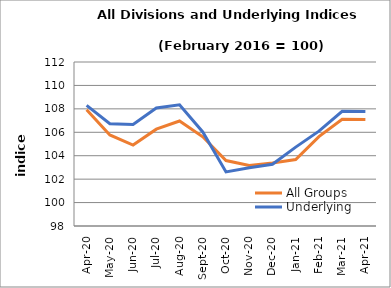
| Category | All Groups | Underlying |
|---|---|---|
| 2020-04-01 | 107.93 | 108.297 |
| 2020-05-01 | 105.77 | 106.735 |
| 2020-06-01 | 104.913 | 106.661 |
| 2020-07-01 | 106.265 | 108.077 |
| 2020-08-01 | 106.963 | 108.349 |
| 2020-09-01 | 105.614 | 106.027 |
| 2020-10-01 | 103.588 | 102.619 |
| 2020-11-01 | 103.171 | 102.969 |
| 2020-12-01 | 103.378 | 103.266 |
| 2021-01-01 | 103.671 | 104.733 |
| 2021-02-01 | 105.627 | 106.099 |
| 2021-03-01 | 107.11 | 107.788 |
| 2021-04-01 | 107.082 | 107.772 |